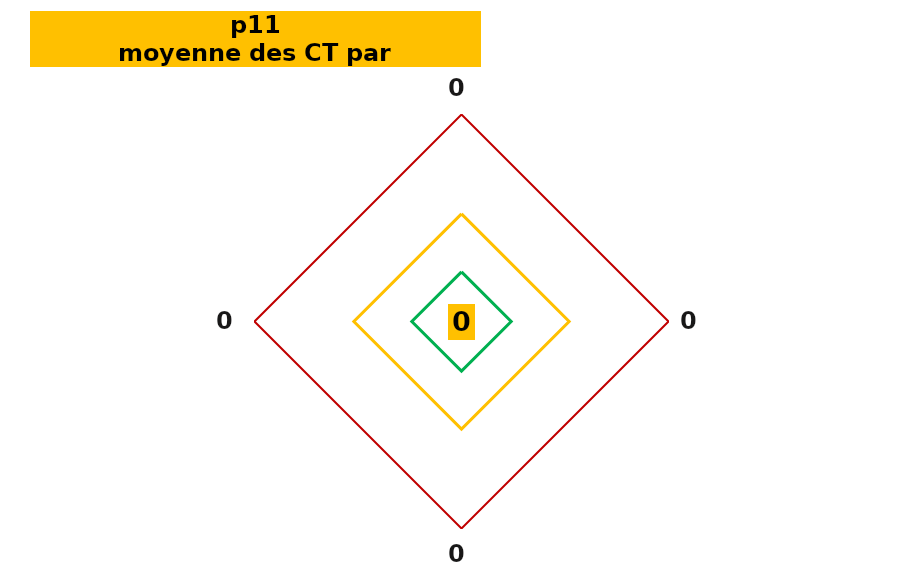
| Category | Series 0 | Series 1 | Series 2 | Series 3 |
|---|---|---|---|---|
| 0.0 | 0 | 6 | 13 | 25 |
| 0.0 | 0 | 6 | 13 | 25 |
| 0.0 | 0 | 6 | 13 | 25 |
| 0.0 | 0 | 6 | 13 | 25 |